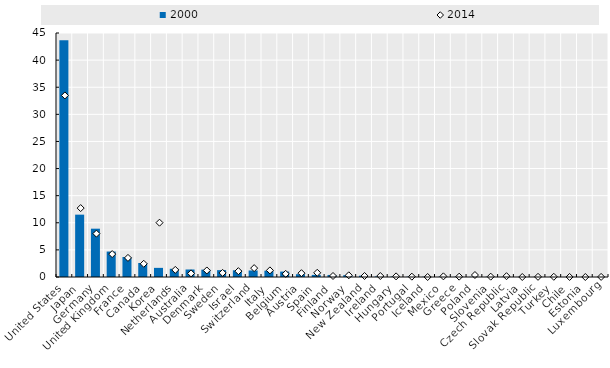
| Category | 2000 |
|---|---|
| United States | 43.64 |
| Japan | 11.499 |
| Germany | 8.91 |
| United Kingdom | 4.695 |
| France | 3.69 |
| Canada | 2.585 |
| Korea | 1.684 |
| Netherlands | 1.516 |
| Australia | 1.384 |
| Denmark | 1.359 |
| Sweden | 1.265 |
| Israel | 1.236 |
| Switzerland | 1.203 |
| Italy | 1.165 |
| Belgium | 1.002 |
| Austria | 0.515 |
| Spain | 0.388 |
| Finland | 0.379 |
| Norway | 0.339 |
| New Zealand | 0.239 |
| Ireland | 0.108 |
| Hungary | 0.091 |
| Portugal | 0.057 |
| Iceland | 0.05 |
| Mexico | 0.045 |
| Greece | 0.038 |
| Poland | 0.027 |
| Slovenia | 0.026 |
| Czech Republic | 0.02 |
| Latvia | 0.014 |
| Slovak Republic | 0.01 |
| Turkey | 0.01 |
| Chile | 0.008 |
| Estonia | 0.006 |
| Luxembourg | 0.002 |